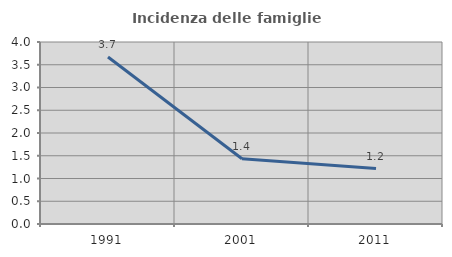
| Category | Incidenza delle famiglie numerose |
|---|---|
| 1991.0 | 3.671 |
| 2001.0 | 1.435 |
| 2011.0 | 1.22 |